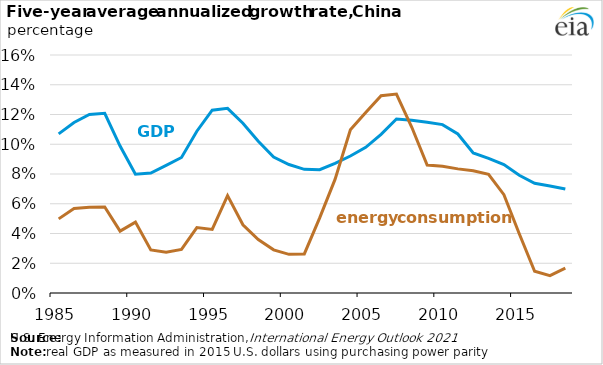
| Category | Gross Domestic Product (GDP) | Energy consumption |
|---|---|---|
| 1985.0 | 0.107 | 0.05 |
| 1986.0 | 0.115 | 0.057 |
| 1987.0 | 0.12 | 0.058 |
| 1988.0 | 0.121 | 0.058 |
| 1989.0 | 0.099 | 0.042 |
| 1990.0 | 0.08 | 0.048 |
| 1991.0 | 0.081 | 0.029 |
| 1992.0 | 0.086 | 0.027 |
| 1993.0 | 0.091 | 0.029 |
| 1994.0 | 0.109 | 0.044 |
| 1995.0 | 0.123 | 0.043 |
| 1996.0 | 0.124 | 0.065 |
| 1997.0 | 0.114 | 0.046 |
| 1998.0 | 0.102 | 0.036 |
| 1999.0 | 0.091 | 0.029 |
| 2000.0 | 0.086 | 0.026 |
| 2001.0 | 0.083 | 0.026 |
| 2002.0 | 0.083 | 0.051 |
| 2003.0 | 0.087 | 0.076 |
| 2004.0 | 0.092 | 0.11 |
| 2005.0 | 0.098 | 0.121 |
| 2006.0 | 0.107 | 0.133 |
| 2007.0 | 0.117 | 0.134 |
| 2008.0 | 0.116 | 0.111 |
| 2009.0 | 0.115 | 0.086 |
| 2010.0 | 0.113 | 0.085 |
| 2011.0 | 0.107 | 0.083 |
| 2012.0 | 0.094 | 0.082 |
| 2013.0 | 0.09 | 0.08 |
| 2014.0 | 0.086 | 0.066 |
| 2015.0 | 0.079 | 0.04 |
| 2016.0 | 0.074 | 0.015 |
| 2017.0 | 0.072 | 0.012 |
| 2018.0 | 0.07 | 0.017 |